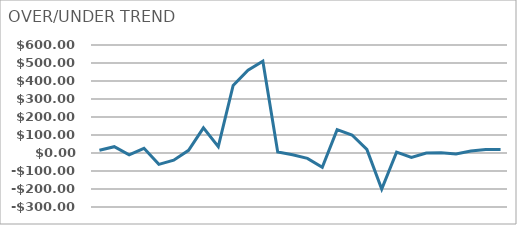
| Category | DIFFERENCE |
|---|---|
| 0 | 15 |
| 1 | 35 |
| 2 | -10 |
| 3 | 26 |
| 4 | -63 |
| 5 | -40 |
| 6 | 15 |
| 7 | 140 |
| 8 | 35 |
| 9 | 375 |
| 10 | 460 |
| 11 | 510 |
| 12 | 6 |
| 13 | -10 |
| 14 | -30 |
| 15 | -80 |
| 16 | 130 |
| 17 | 100 |
| 18 | 20 |
| 19 | -200 |
| 20 | 5 |
| 21 | -25 |
| 22 | 0 |
| 23 | 1 |
| 24 | -5 |
| 25 | 11 |
| 26 | 20 |
| 27 | 20 |